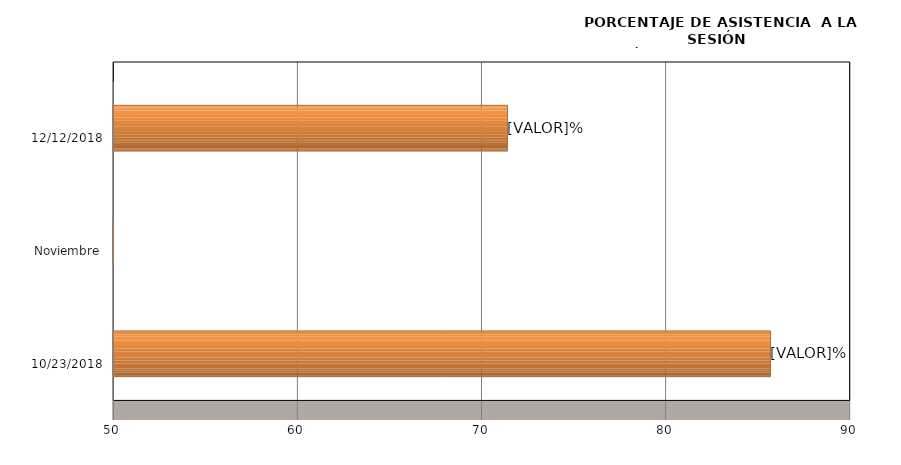
| Category | Series 0 |
|---|---|
| 23/10/2018 | 85.714 |
| Noviembre | 0 |
| 12/12/2018 | 71.429 |